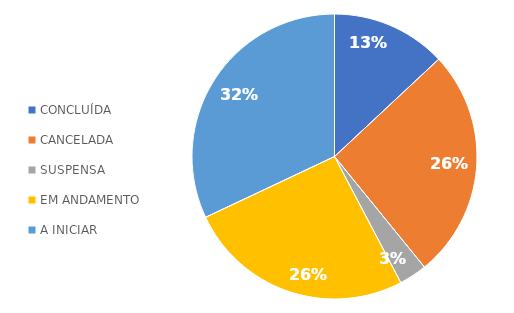
| Category | CONCLUÍDA |
|---|---|
| CONCLUÍDA | 33 |
| CANCELADA | 66 |
| SUSPENSA | 8 |
| EM ANDAMENTO | 65 |
| A INICIAR | 81 |